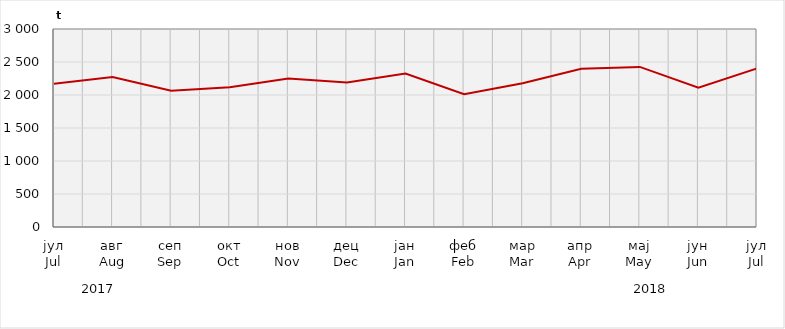
| Category | Нето тежина заклане стоке                              Net weight of  slaughtered livestock |
|---|---|
| јул
Jul | 2169976.6 |
| авг
Aug | 2273238.2 |
| сеп
Sep | 2066000 |
| окт
Oct | 2118775.52 |
| нов
Nov | 2248639.95 |
| дец
Dec | 2190874.83 |
| јан
Jan | 2324971.47 |
| феб
Feb | 2010400 |
| мар
Mar | 2177800 |
| апр
Apr | 2398200 |
| мај
May | 2425732.22 |
| јун
Jun | 2110195.14 |
| јул
Jul | 2402333.82 |